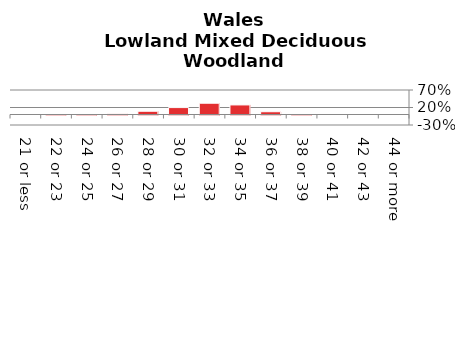
| Category | Lowland Mixed Deciduous Woodland |
|---|---|
| 21 or less | 0 |
| 22 or 23 | 0.001 |
| 24 or 25 | 0.006 |
| 26 or 27 | 0.019 |
| 28 or 29 | 0.093 |
| 30 or 31 | 0.197 |
| 32 or 33 | 0.322 |
| 34 or 35 | 0.274 |
| 36 or 37 | 0.079 |
| 38 or 39 | 0.01 |
| 40 or 41 | 0 |
| 42 or 43 | 0 |
| 44 or more | 0 |